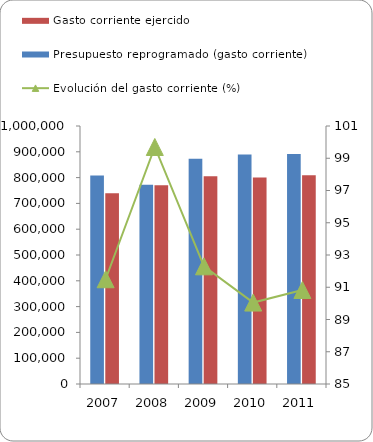
| Category | Presupuesto reprogramado (gasto corriente) | Gasto corriente ejercido |
|---|---|---|
| 2007 | 808113 | 739388 |
| 2008 | 772288 | 769961 |
| 2009 | 872668 | 805455 |
| 2010 | 889296 | 800820 |
| 2011 | 891084 | 809367 |